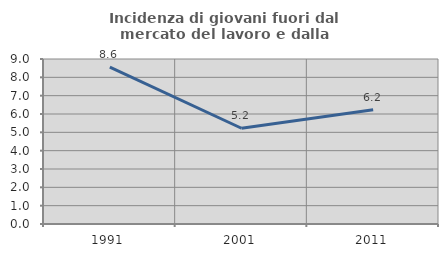
| Category | Incidenza di giovani fuori dal mercato del lavoro e dalla formazione  |
|---|---|
| 1991.0 | 8.562 |
| 2001.0 | 5.222 |
| 2011.0 | 6.236 |